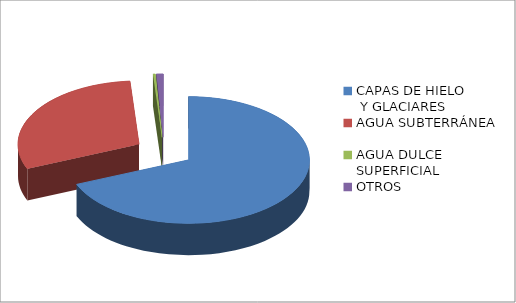
| Category | Series 0 |
|---|---|
| CAPAS DE HIELO
 Y GLACIARES | 0.687 |
| AGUA SUBTERRÁNEA | 0.301 |
| AGUA DULCE SUPERFICIAL | 0.003 |
| OTROS | 0.009 |